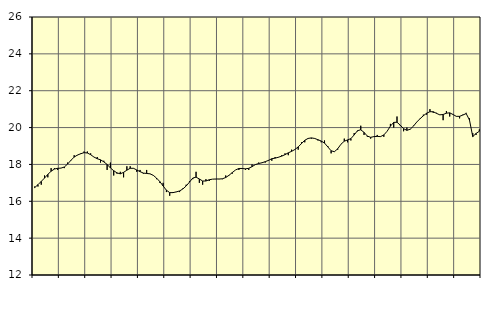
| Category | Piggar | Vård och omsorg, SNI 86-88 |
|---|---|---|
| nan | 16.8 | 16.74 |
| 87.0 | 16.8 | 16.9 |
| 87.0 | 16.9 | 17.08 |
| 87.0 | 17.4 | 17.26 |
| nan | 17.3 | 17.46 |
| 88.0 | 17.8 | 17.63 |
| 88.0 | 17.8 | 17.75 |
| 88.0 | 17.7 | 17.79 |
| nan | 17.8 | 17.8 |
| 89.0 | 17.8 | 17.86 |
| 89.0 | 18.1 | 18.02 |
| 89.0 | 18.2 | 18.22 |
| nan | 18.5 | 18.4 |
| 90.0 | 18.5 | 18.51 |
| 90.0 | 18.6 | 18.58 |
| 90.0 | 18.7 | 18.64 |
| nan | 18.7 | 18.62 |
| 91.0 | 18.6 | 18.53 |
| 91.0 | 18.4 | 18.4 |
| 91.0 | 18.4 | 18.31 |
| nan | 18.1 | 18.25 |
| 92.0 | 18.2 | 18.14 |
| 92.0 | 17.7 | 18 |
| 92.0 | 18.1 | 17.81 |
| nan | 17.4 | 17.66 |
| 93.0 | 17.5 | 17.54 |
| 93.0 | 17.6 | 17.49 |
| 93.0 | 17.3 | 17.57 |
| nan | 17.9 | 17.69 |
| 94.0 | 17.9 | 17.79 |
| 94.0 | 17.8 | 17.79 |
| 94.0 | 17.6 | 17.7 |
| nan | 17.7 | 17.61 |
| 95.0 | 17.5 | 17.53 |
| 95.0 | 17.7 | 17.51 |
| 95.0 | 17.5 | 17.49 |
| nan | 17.4 | 17.41 |
| 96.0 | 17.2 | 17.26 |
| 96.0 | 17 | 17.07 |
| 96.0 | 17 | 16.83 |
| nan | 16.5 | 16.6 |
| 97.0 | 16.3 | 16.47 |
| 97.0 | 16.5 | 16.47 |
| 97.0 | 16.5 | 16.51 |
| nan | 16.5 | 16.56 |
| 98.0 | 16.7 | 16.67 |
| 98.0 | 16.9 | 16.83 |
| 98.0 | 17.1 | 17.04 |
| nan | 17.2 | 17.26 |
| 99.0 | 17.6 | 17.31 |
| 99.0 | 17 | 17.21 |
| 99.0 | 16.9 | 17.1 |
| nan | 17.2 | 17.1 |
| 0.0 | 17.1 | 17.17 |
| 0.0 | 17.2 | 17.2 |
| 0.0 | 17.2 | 17.21 |
| nan | 17.2 | 17.21 |
| 1.0 | 17.2 | 17.22 |
| 1.0 | 17.4 | 17.29 |
| 1.0 | 17.4 | 17.41 |
| nan | 17.5 | 17.56 |
| 2.0 | 17.7 | 17.7 |
| 2.0 | 17.7 | 17.78 |
| 2.0 | 17.8 | 17.78 |
| nan | 17.7 | 17.76 |
| 3.0 | 17.7 | 17.79 |
| 3.0 | 18 | 17.88 |
| 3.0 | 18 | 17.99 |
| nan | 18.1 | 18.05 |
| 4.0 | 18.1 | 18.09 |
| 4.0 | 18.1 | 18.15 |
| 4.0 | 18.2 | 18.22 |
| nan | 18.2 | 18.31 |
| 5.0 | 18.4 | 18.34 |
| 5.0 | 18.4 | 18.39 |
| 5.0 | 18.5 | 18.45 |
| nan | 18.6 | 18.53 |
| 6.0 | 18.5 | 18.63 |
| 6.0 | 18.8 | 18.71 |
| 6.0 | 18.8 | 18.81 |
| nan | 18.8 | 18.95 |
| 7.0 | 19.2 | 19.13 |
| 7.0 | 19.2 | 19.31 |
| 7.0 | 19.4 | 19.41 |
| nan | 19.4 | 19.44 |
| 8.0 | 19.4 | 19.41 |
| 8.0 | 19.3 | 19.34 |
| 8.0 | 19.2 | 19.27 |
| nan | 19.3 | 19.16 |
| 9.0 | 19 | 18.95 |
| 9.0 | 18.6 | 18.74 |
| 9.0 | 18.7 | 18.69 |
| nan | 18.8 | 18.85 |
| 10.0 | 19.1 | 19.1 |
| 10.0 | 19.4 | 19.26 |
| 10.0 | 19.2 | 19.33 |
| nan | 19.3 | 19.4 |
| 11.0 | 19.7 | 19.6 |
| 11.0 | 19.8 | 19.83 |
| 11.0 | 20.1 | 19.88 |
| nan | 19.6 | 19.74 |
| 12.0 | 19.5 | 19.54 |
| 12.0 | 19.4 | 19.47 |
| 12.0 | 19.5 | 19.51 |
| nan | 19.6 | 19.52 |
| 13.0 | 19.5 | 19.51 |
| 13.0 | 19.5 | 19.6 |
| 13.0 | 19.8 | 19.8 |
| nan | 20.2 | 20.08 |
| 14.0 | 20 | 20.28 |
| 14.0 | 20.6 | 20.29 |
| 14.0 | 20.1 | 20.13 |
| nan | 19.8 | 19.94 |
| 15.0 | 20 | 19.85 |
| 15.0 | 19.9 | 19.91 |
| 15.0 | 20.1 | 20.08 |
| nan | 20.3 | 20.3 |
| 16.0 | 20.5 | 20.48 |
| 16.0 | 20.7 | 20.64 |
| 16.0 | 20.7 | 20.78 |
| nan | 21 | 20.86 |
| 17.0 | 20.8 | 20.86 |
| 17.0 | 20.8 | 20.77 |
| 17.0 | 20.7 | 20.69 |
| nan | 20.4 | 20.71 |
| 18.0 | 20.9 | 20.78 |
| 18.0 | 20.6 | 20.8 |
| 18.0 | 20.7 | 20.71 |
| nan | 20.6 | 20.61 |
| 19.0 | 20.5 | 20.61 |
| 19.0 | 20.7 | 20.68 |
| 19.0 | 20.8 | 20.76 |
| nan | 20.5 | 20.41 |
| 20.0 | 19.7 | 19.51 |
| 20.0 | 19.6 | 19.68 |
| 20.0 | 19.9 | 19.8 |